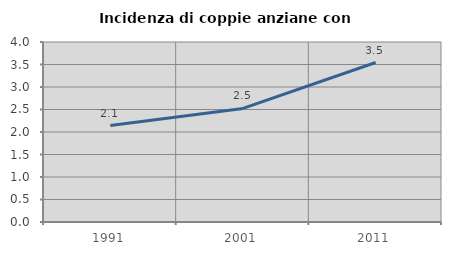
| Category | Incidenza di coppie anziane con figli |
|---|---|
| 1991.0 | 2.142 |
| 2001.0 | 2.524 |
| 2011.0 | 3.544 |